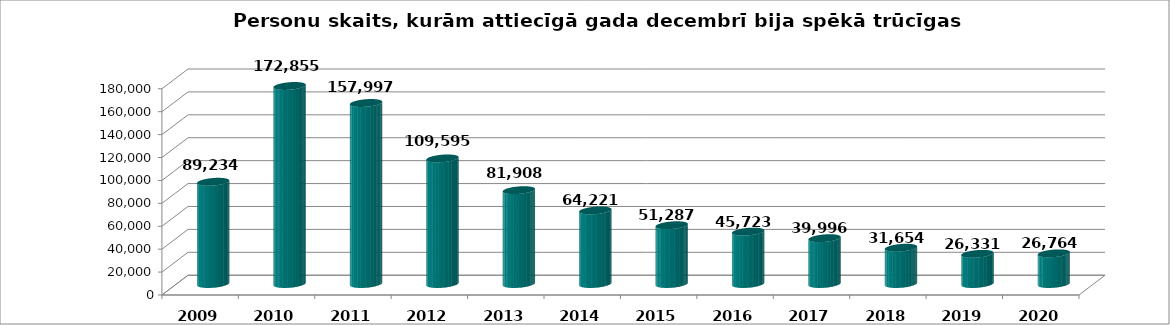
| Category | novembris |
|---|---|
| 2009.0 | 89234 |
| 2010.0 | 172855 |
| 2011.0 | 157997 |
| 2012.0 | 109595 |
| 2013.0 | 81908 |
| 2014.0 | 64221 |
| 2015.0 | 51287 |
| 2016.0 | 45723 |
| 2017.0 | 39996 |
| 2018.0 | 31654 |
| 2019.0 | 26331 |
| 2020.0 | 26764 |